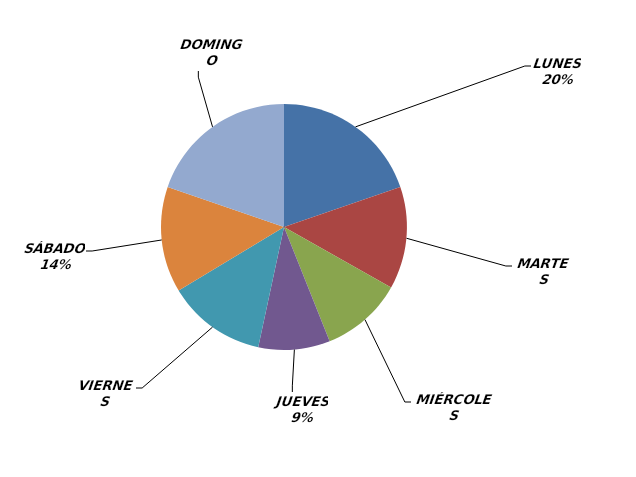
| Category | Series 0 |
|---|---|
| LUNES | 44 |
| MARTES | 30 |
| MIÉRCOLES | 24 |
| JUEVES | 21 |
| VIERNES | 29 |
| SÁBADO | 31 |
| DOMINGO | 44 |